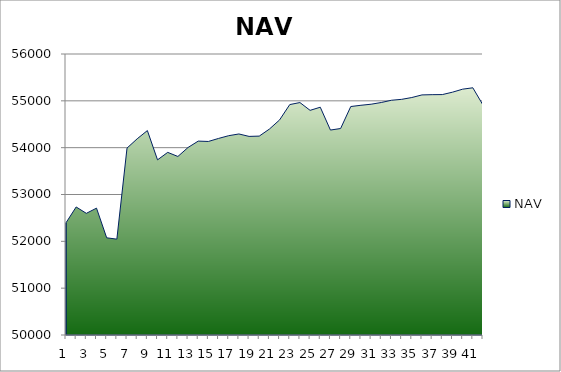
| Category | NAV |
|---|---|
| 0 | 52397 |
| 1 | 52733.957 |
| 2 | 52597.875 |
| 3 | 52708.772 |
| 4 | 52075.184 |
| 5 | 52046.775 |
| 6 | 53991.219 |
| 7 | 54189.909 |
| 8 | 54364.909 |
| 9 | 53739.909 |
| 10 | 53899.542 |
| 11 | 53812.294 |
| 12 | 54003.961 |
| 13 | 54140.037 |
| 14 | 54132.37 |
| 15 | 54197.37 |
| 16 | 54255.812 |
| 17 | 54292.622 |
| 18 | 54240.699 |
| 19 | 54246.834 |
| 20 | 54397.391 |
| 21 | 54592.197 |
| 22 | 54920.119 |
| 23 | 54963.245 |
| 24 | 54796.799 |
| 25 | 54863.963 |
| 26 | 54375.975 |
| 27 | 54409.015 |
| 28 | 54878.402 |
| 29 | 54905.151 |
| 30 | 54927.958 |
| 31 | 54964.157 |
| 32 | 55012.385 |
| 33 | 55031.616 |
| 34 | 55070.791 |
| 35 | 55126.461 |
| 36 | 55131.71 |
| 37 | 55133.391 |
| 38 | 55184.783 |
| 39 | 55249.119 |
| 40 | 55278.196 |
| 41 | 54909.993 |